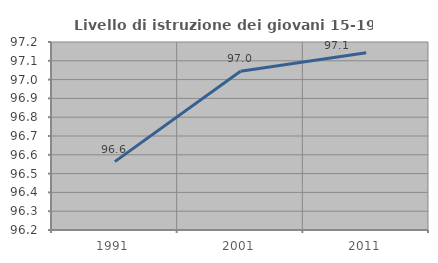
| Category | Livello di istruzione dei giovani 15-19 anni |
|---|---|
| 1991.0 | 96.564 |
| 2001.0 | 97.044 |
| 2011.0 | 97.143 |